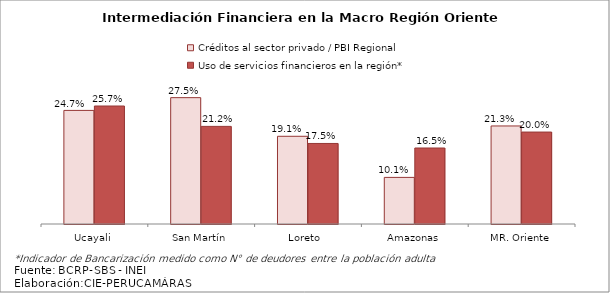
| Category | Créditos al sector privado / PBI Regional | Uso de servicios financieros en la región* |
|---|---|---|
| Ucayali | 0.247 | 0.256 |
| San Martín | 0.275 | 0.212 |
| Loreto  | 0.191 | 0.175 |
| Amazonas | 0.101 | 0.165 |
| MR. Oriente | 0.213 | 0.2 |